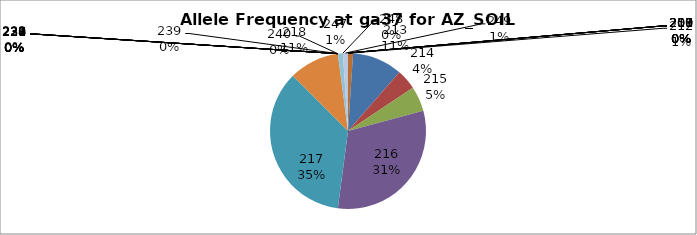
| Category | Series 0 |
|---|---|
| 207.0 | 0 |
| 208.0 | 0 |
| 209.0 | 0 |
| 210.0 | 0 |
| 211.0 | 0 |
| 212.0 | 0.01 |
| 213.0 | 0.104 |
| 214.0 | 0.042 |
| 215.0 | 0.052 |
| 216.0 | 0.312 |
| 217.0 | 0.354 |
| 218.0 | 0.104 |
| 226.0 | 0 |
| 227.0 | 0 |
| 228.0 | 0 |
| 229.0 | 0 |
| 230.0 | 0 |
| 231.0 | 0 |
| 232.0 | 0 |
| 234.0 | 0 |
| 239.0 | 0 |
| 240.0 | 0 |
| 247.0 | 0.01 |
| 248.0 | 0 |
| 249.0 | 0.01 |
| 250.0 | 0 |